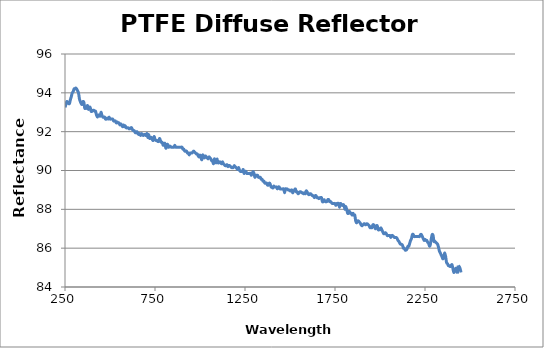
| Category | Reflectance (%) |
|---|---|
| 250.0 | 93.25 |
| 255.0 | 93.4 |
| 260.0 | 93.55 |
| 265.0 | 93.5 |
| 270.0 | 93.45 |
| 275.0 | 93.45 |
| 280.0 | 93.65 |
| 285.0 | 93.8 |
| 290.0 | 94 |
| 295.0 | 94.05 |
| 300.0 | 94.2 |
| 305.0 | 94.2 |
| 310.0 | 94.25 |
| 315.0 | 94.2 |
| 320.0 | 94.1 |
| 325.0 | 94 |
| 330.0 | 93.7 |
| 335.0 | 93.55 |
| 340.0 | 93.45 |
| 345.0 | 93.4 |
| 350.0 | 93.55 |
| 355.0 | 93.5 |
| 360.0 | 93.2 |
| 365.0 | 93.25 |
| 370.0 | 93.2 |
| 375.0 | 93.35 |
| 380.0 | 93.15 |
| 385.0 | 93.25 |
| 390.0 | 93.25 |
| 395.0 | 93.05 |
| 400.0 | 93.05 |
| 405.0 | 93.1 |
| 410.0 | 93.1 |
| 415.0 | 93.05 |
| 420.0 | 93.05 |
| 425.0 | 92.85 |
| 430.0 | 92.75 |
| 435.0 | 92.85 |
| 440.0 | 92.85 |
| 445.0 | 92.8 |
| 450.0 | 93 |
| 455.0 | 92.85 |
| 460.0 | 92.75 |
| 465.0 | 92.75 |
| 470.0 | 92.75 |
| 475.0 | 92.65 |
| 480.0 | 92.65 |
| 485.0 | 92.7 |
| 490.0 | 92.65 |
| 495.0 | 92.75 |
| 500.0 | 92.65 |
| 505.0 | 92.65 |
| 510.0 | 92.65 |
| 515.0 | 92.65 |
| 520.0 | 92.55 |
| 525.0 | 92.55 |
| 530.0 | 92.55 |
| 535.0 | 92.45 |
| 540.0 | 92.5 |
| 545.0 | 92.45 |
| 550.0 | 92.45 |
| 555.0 | 92.35 |
| 560.0 | 92.4 |
| 565.0 | 92.35 |
| 570.0 | 92.25 |
| 575.0 | 92.35 |
| 580.0 | 92.25 |
| 585.0 | 92.3 |
| 590.0 | 92.2 |
| 595.0 | 92.2 |
| 600.0 | 92.2 |
| 605.0 | 92.15 |
| 610.0 | 92.15 |
| 615.0 | 92.2 |
| 620.0 | 92.2 |
| 625.0 | 92.1 |
| 630.0 | 92.05 |
| 635.0 | 92.05 |
| 640.0 | 91.95 |
| 645.0 | 91.95 |
| 650.0 | 92 |
| 655.0 | 91.9 |
| 660.0 | 91.85 |
| 665.0 | 91.9 |
| 670.0 | 91.8 |
| 675.0 | 91.9 |
| 680.0 | 91.85 |
| 685.0 | 91.8 |
| 690.0 | 91.85 |
| 695.0 | 91.85 |
| 700.0 | 91.8 |
| 705.0 | 91.9 |
| 710.0 | 91.7 |
| 715.0 | 91.85 |
| 720.0 | 91.65 |
| 725.0 | 91.7 |
| 730.0 | 91.7 |
| 735.0 | 91.6 |
| 740.0 | 91.55 |
| 745.0 | 91.75 |
| 750.0 | 91.6 |
| 755.0 | 91.55 |
| 760.0 | 91.55 |
| 765.0 | 91.5 |
| 770.0 | 91.5 |
| 775.0 | 91.65 |
| 780.0 | 91.55 |
| 785.0 | 91.45 |
| 790.0 | 91.45 |
| 795.0 | 91.3 |
| 800.0 | 91.35 |
| 805.0 | 91.4 |
| 810.0 | 91.15 |
| 815.0 | 91.25 |
| 820.0 | 91.35 |
| 825.0 | 91.2 |
| 830.0 | 91.25 |
| 835.0 | 91.25 |
| 840.0 | 91.2 |
| 845.0 | 91.2 |
| 850.0 | 91.2 |
| 855.0 | 91.2 |
| 860.0 | 91.3 |
| 865.0 | 91.2 |
| 870.0 | 91.2 |
| 875.0 | 91.2 |
| 880.0 | 91.2 |
| 885.0 | 91.2 |
| 890.0 | 91.2 |
| 895.0 | 91.2 |
| 900.0 | 91.2 |
| 905.0 | 91.1 |
| 910.0 | 91.1 |
| 915.0 | 91 |
| 920.0 | 91 |
| 925.0 | 91 |
| 930.0 | 90.9 |
| 935.0 | 90.9 |
| 940.0 | 90.8 |
| 945.0 | 90.9 |
| 950.0 | 90.9 |
| 955.0 | 90.9 |
| 960.0 | 90.95 |
| 965.0 | 91 |
| 970.0 | 90.95 |
| 975.0 | 90.9 |
| 980.0 | 90.85 |
| 985.0 | 90.85 |
| 990.0 | 90.75 |
| 995.0 | 90.7 |
| 1000.0 | 90.8 |
| 1005.0 | 90.7 |
| 1010.0 | 90.55 |
| 1015.0 | 90.8 |
| 1020.0 | 90.7 |
| 1025.0 | 90.65 |
| 1030.0 | 90.75 |
| 1035.0 | 90.7 |
| 1040.0 | 90.65 |
| 1045.0 | 90.6 |
| 1050.0 | 90.7 |
| 1055.0 | 90.65 |
| 1060.0 | 90.6 |
| 1065.0 | 90.5 |
| 1070.0 | 90.5 |
| 1075.0 | 90.35 |
| 1080.0 | 90.6 |
| 1085.0 | 90.45 |
| 1090.0 | 90.4 |
| 1095.0 | 90.6 |
| 1100.0 | 90.4 |
| 1105.0 | 90.4 |
| 1110.0 | 90.45 |
| 1115.0 | 90.4 |
| 1120.0 | 90.35 |
| 1125.0 | 90.45 |
| 1130.0 | 90.35 |
| 1135.0 | 90.3 |
| 1140.0 | 90.25 |
| 1145.0 | 90.25 |
| 1150.0 | 90.3 |
| 1155.0 | 90.2 |
| 1160.0 | 90.25 |
| 1165.0 | 90.25 |
| 1170.0 | 90.2 |
| 1175.0 | 90.15 |
| 1180.0 | 90.15 |
| 1185.0 | 90.15 |
| 1190.0 | 90.25 |
| 1195.0 | 90.2 |
| 1200.0 | 90.15 |
| 1205.0 | 90.1 |
| 1210.0 | 90.05 |
| 1215.0 | 90.15 |
| 1220.0 | 90 |
| 1225.0 | 89.95 |
| 1230.0 | 89.95 |
| 1235.0 | 89.95 |
| 1240.0 | 90.05 |
| 1245.0 | 89.85 |
| 1250.0 | 89.95 |
| 1255.0 | 89.95 |
| 1260.0 | 89.85 |
| 1265.0 | 89.85 |
| 1270.0 | 89.85 |
| 1275.0 | 89.85 |
| 1280.0 | 89.85 |
| 1285.0 | 89.75 |
| 1290.0 | 89.85 |
| 1295.0 | 89.95 |
| 1300.0 | 89.85 |
| 1305.0 | 89.65 |
| 1310.0 | 89.75 |
| 1315.0 | 89.75 |
| 1320.0 | 89.75 |
| 1325.0 | 89.65 |
| 1330.0 | 89.65 |
| 1335.0 | 89.65 |
| 1340.0 | 89.55 |
| 1345.0 | 89.55 |
| 1350.0 | 89.45 |
| 1355.0 | 89.45 |
| 1360.0 | 89.35 |
| 1365.0 | 89.35 |
| 1370.0 | 89.35 |
| 1375.0 | 89.25 |
| 1380.0 | 89.25 |
| 1385.0 | 89.35 |
| 1390.0 | 89.3 |
| 1395.0 | 89.15 |
| 1400.0 | 89.15 |
| 1405.0 | 89.1 |
| 1410.0 | 89.2 |
| 1415.0 | 89.15 |
| 1420.0 | 89.15 |
| 1425.0 | 89.15 |
| 1430.0 | 89.05 |
| 1435.0 | 89.15 |
| 1440.0 | 89.15 |
| 1445.0 | 89.05 |
| 1450.0 | 89.05 |
| 1455.0 | 89.05 |
| 1460.0 | 89.05 |
| 1465.0 | 89.05 |
| 1470.0 | 88.85 |
| 1475.0 | 89.05 |
| 1480.0 | 89.05 |
| 1485.0 | 89.05 |
| 1490.0 | 89 |
| 1495.0 | 89 |
| 1500.0 | 88.95 |
| 1505.0 | 88.95 |
| 1510.0 | 89 |
| 1515.0 | 88.85 |
| 1520.0 | 88.95 |
| 1525.0 | 89 |
| 1530.0 | 89.05 |
| 1535.0 | 88.9 |
| 1540.0 | 88.9 |
| 1545.0 | 88.8 |
| 1550.0 | 88.85 |
| 1555.0 | 88.9 |
| 1560.0 | 88.9 |
| 1565.0 | 88.85 |
| 1570.0 | 88.85 |
| 1575.0 | 88.8 |
| 1580.0 | 88.85 |
| 1585.0 | 88.8 |
| 1590.0 | 88.95 |
| 1595.0 | 88.9 |
| 1600.0 | 88.8 |
| 1605.0 | 88.75 |
| 1610.0 | 88.8 |
| 1615.0 | 88.8 |
| 1620.0 | 88.75 |
| 1625.0 | 88.7 |
| 1630.0 | 88.7 |
| 1635.0 | 88.6 |
| 1640.0 | 88.7 |
| 1645.0 | 88.7 |
| 1650.0 | 88.6 |
| 1655.0 | 88.6 |
| 1660.0 | 88.55 |
| 1665.0 | 88.6 |
| 1670.0 | 88.6 |
| 1675.0 | 88.6 |
| 1680.0 | 88.4 |
| 1685.0 | 88.4 |
| 1690.0 | 88.5 |
| 1695.0 | 88.4 |
| 1700.0 | 88.4 |
| 1705.0 | 88.4 |
| 1710.0 | 88.5 |
| 1715.0 | 88.5 |
| 1720.0 | 88.4 |
| 1725.0 | 88.4 |
| 1730.0 | 88.35 |
| 1735.0 | 88.3 |
| 1740.0 | 88.3 |
| 1745.0 | 88.3 |
| 1750.0 | 88.3 |
| 1755.0 | 88.2 |
| 1760.0 | 88.3 |
| 1765.0 | 88.3 |
| 1770.0 | 88.3 |
| 1775.0 | 88.1 |
| 1780.0 | 88.3 |
| 1785.0 | 88.25 |
| 1790.0 | 88.2 |
| 1795.0 | 88.25 |
| 1800.0 | 88.2 |
| 1805.0 | 88 |
| 1810.0 | 88.15 |
| 1815.0 | 88 |
| 1820.0 | 87.8 |
| 1825.0 | 87.8 |
| 1830.0 | 87.9 |
| 1835.0 | 87.8 |
| 1840.0 | 87.8 |
| 1845.0 | 87.7 |
| 1850.0 | 87.8 |
| 1855.0 | 87.7 |
| 1860.0 | 87.7 |
| 1865.0 | 87.4 |
| 1870.0 | 87.3 |
| 1875.0 | 87.4 |
| 1880.0 | 87.4 |
| 1885.0 | 87.35 |
| 1890.0 | 87.3 |
| 1895.0 | 87.2 |
| 1900.0 | 87.15 |
| 1905.0 | 87.2 |
| 1910.0 | 87.25 |
| 1915.0 | 87.25 |
| 1920.0 | 87.2 |
| 1925.0 | 87.25 |
| 1930.0 | 87.25 |
| 1935.0 | 87.2 |
| 1940.0 | 87.15 |
| 1945.0 | 87.05 |
| 1950.0 | 87.1 |
| 1955.0 | 87.05 |
| 1960.0 | 87.2 |
| 1965.0 | 87.2 |
| 1970.0 | 87.1 |
| 1975.0 | 87 |
| 1980.0 | 87.15 |
| 1985.0 | 87.15 |
| 1990.0 | 86.95 |
| 1995.0 | 86.95 |
| 2000.0 | 86.95 |
| 2005.0 | 87.05 |
| 2010.0 | 86.95 |
| 2015.0 | 86.85 |
| 2020.0 | 86.75 |
| 2025.0 | 86.75 |
| 2030.0 | 86.8 |
| 2035.0 | 86.75 |
| 2040.0 | 86.65 |
| 2045.0 | 86.65 |
| 2050.0 | 86.65 |
| 2055.0 | 86.65 |
| 2060.0 | 86.55 |
| 2065.0 | 86.65 |
| 2070.0 | 86.65 |
| 2075.0 | 86.6 |
| 2080.0 | 86.55 |
| 2085.0 | 86.55 |
| 2090.0 | 86.55 |
| 2095.0 | 86.5 |
| 2100.0 | 86.4 |
| 2105.0 | 86.35 |
| 2110.0 | 86.25 |
| 2115.0 | 86.2 |
| 2120.0 | 86.2 |
| 2125.0 | 86.15 |
| 2130.0 | 86 |
| 2135.0 | 86 |
| 2140.0 | 85.9 |
| 2145.0 | 85.9 |
| 2150.0 | 85.95 |
| 2155.0 | 86.1 |
| 2160.0 | 86.1 |
| 2165.0 | 86.25 |
| 2170.0 | 86.4 |
| 2175.0 | 86.5 |
| 2180.0 | 86.7 |
| 2185.0 | 86.7 |
| 2190.0 | 86.6 |
| 2195.0 | 86.6 |
| 2200.0 | 86.6 |
| 2205.0 | 86.6 |
| 2210.0 | 86.6 |
| 2215.0 | 86.6 |
| 2220.0 | 86.6 |
| 2225.0 | 86.7 |
| 2230.0 | 86.7 |
| 2235.0 | 86.6 |
| 2240.0 | 86.5 |
| 2245.0 | 86.4 |
| 2250.0 | 86.45 |
| 2255.0 | 86.4 |
| 2260.0 | 86.4 |
| 2265.0 | 86.3 |
| 2270.0 | 86.25 |
| 2275.0 | 86.1 |
| 2280.0 | 86.2 |
| 2285.0 | 86.5 |
| 2290.0 | 86.7 |
| 2295.0 | 86.65 |
| 2300.0 | 86.35 |
| 2305.0 | 86.35 |
| 2310.0 | 86.3 |
| 2315.0 | 86.25 |
| 2320.0 | 86.2 |
| 2325.0 | 86.05 |
| 2330.0 | 85.85 |
| 2335.0 | 85.75 |
| 2340.0 | 85.65 |
| 2345.0 | 85.55 |
| 2350.0 | 85.45 |
| 2355.0 | 85.6 |
| 2360.0 | 85.75 |
| 2365.0 | 85.55 |
| 2370.0 | 85.25 |
| 2375.0 | 85.2 |
| 2380.0 | 85.1 |
| 2385.0 | 85.1 |
| 2390.0 | 85.05 |
| 2395.0 | 85.1 |
| 2400.0 | 85.15 |
| 2405.0 | 84.95 |
| 2410.0 | 84.75 |
| 2415.0 | 84.85 |
| 2420.0 | 84.95 |
| 2425.0 | 84.95 |
| 2430.0 | 84.7 |
| 2435.0 | 85.1 |
| 2440.0 | 85.05 |
| 2445.0 | 84.95 |
| 2450.0 | 84.75 |